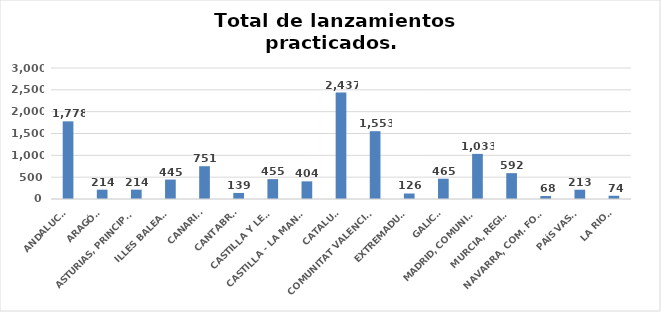
| Category | 616 |
|---|---|
| ANDALUCÍA | 1778 |
| ARAGÓN | 214 |
| ASTURIAS, PRINCIPADO | 214 |
| ILLES BALEARS | 445 |
| CANARIAS | 751 |
| CANTABRIA | 139 |
| CASTILLA Y LEÓN | 455 |
| CASTILLA - LA MANCHA | 404 |
| CATALUÑA | 2437 |
| COMUNITAT VALENCIANA | 1553 |
| EXTREMADURA | 126 |
| GALICIA | 465 |
| MADRID, COMUNIDAD | 1033 |
| MURCIA, REGIÓN | 592 |
| NAVARRA, COM. FORAL | 68 |
| PAÍS VASCO | 213 |
| LA RIOJA | 74 |